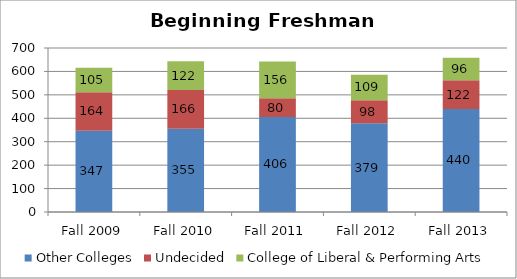
| Category | Other Colleges | Undecided | College of Liberal & Performing Arts |
|---|---|---|---|
| Fall 2009 | 347 | 164 | 105 |
| Fall 2010 | 355 | 166 | 122 |
| Fall 2011 | 406 | 80 | 156 |
| Fall 2012 | 379 | 98 | 109 |
| Fall 2013 | 440 | 122 | 96 |